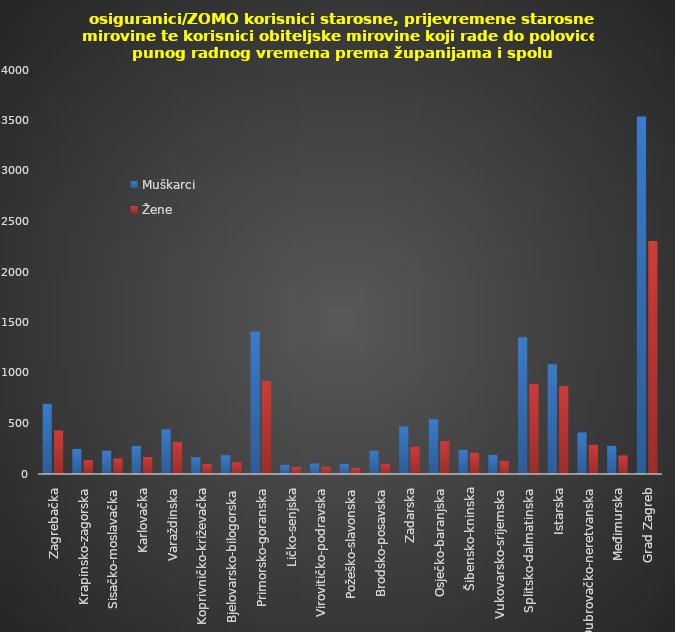
| Category | Muškarci | Žene |
|---|---|---|
| Zagrebačka | 697 | 431 |
| Krapinsko-zagorska | 248 | 141 |
| Sisačko-moslavačka | 232 | 154 |
| Karlovačka | 280 | 168 |
| Varaždinska | 442 | 320 |
| Koprivničko-križevačka | 166 | 98 |
| Bjelovarsko-bilogorska | 186 | 116 |
| Primorsko-goranska | 1411 | 922 |
| Ličko-senjska | 92 | 69 |
| Virovitičko-podravska | 104 | 74 |
| Požeško-slavonska | 98 | 59 |
| Brodsko-posavska | 232 | 100 |
| Zadarska | 471 | 272 |
| Osječko-baranjska | 543 | 326 |
| Šibensko-kninska | 240 | 211 |
| Vukovarsko-srijemska | 190 | 131 |
| Splitsko-dalmatinska | 1353 | 895 |
| Istarska | 1087 | 869 |
| Dubrovačko-neretvanska | 411 | 290 |
| Međimurska | 279 | 184 |
| Grad Zagreb | 3540 | 2307 |